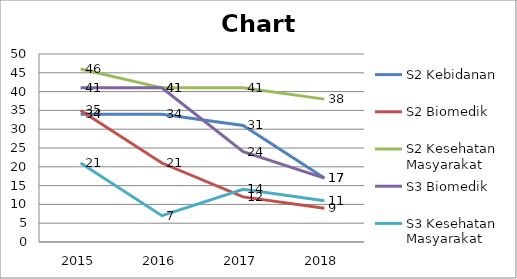
| Category | S2 Kebidanan | S2 Biomedik | S2 Kesehatan Masyarakat | S3 Biomedik | S3 Kesehatan Masyarakat |
|---|---|---|---|---|---|
| 2015 | 34 | 35 | 46 | 41 | 21 |
| 2016 | 34 | 21 | 41 | 41 | 7 |
| 2017 | 31 | 12 | 41 | 24 | 14 |
| 2018 | 17 | 9 | 38 | 17 | 11 |